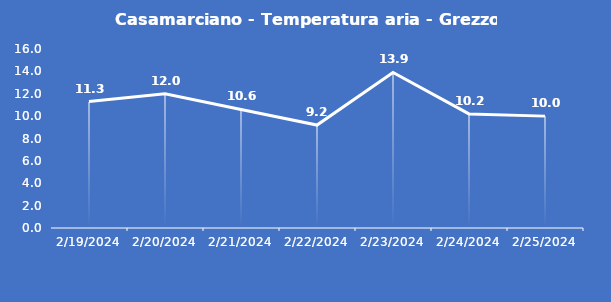
| Category | Casamarciano - Temperatura aria - Grezzo (°C) |
|---|---|
| 2/19/24 | 11.3 |
| 2/20/24 | 12 |
| 2/21/24 | 10.6 |
| 2/22/24 | 9.2 |
| 2/23/24 | 13.9 |
| 2/24/24 | 10.2 |
| 2/25/24 | 10 |